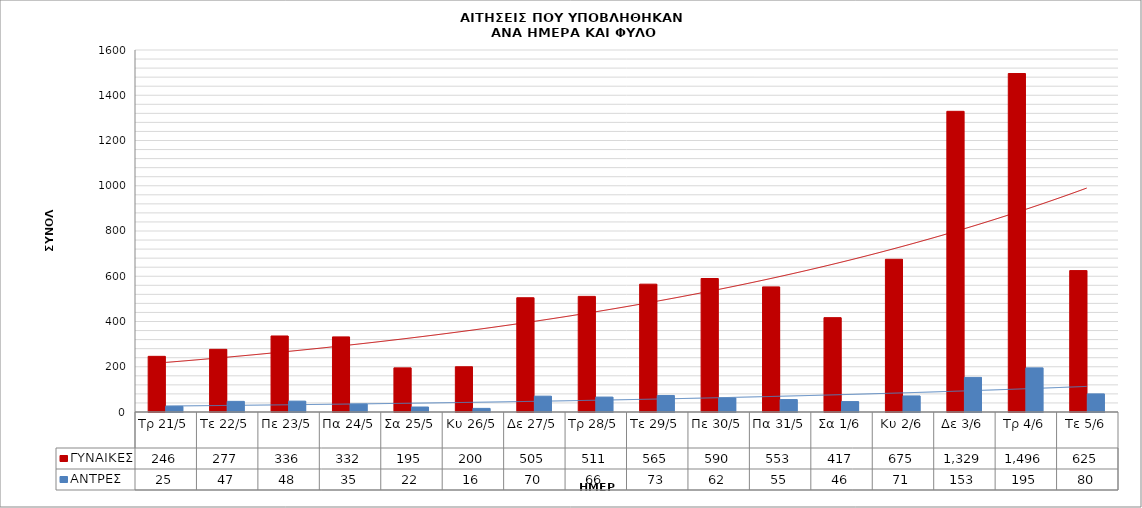
| Category | ΓΥΝΑΙΚΕΣ | ΑΝΤΡΕΣ |
|---|---|---|
| Τρ 21/5 | 246 | 25 |
| Τε 22/5 | 277 | 47 |
| Πε 23/5 | 336 | 48 |
| Πα 24/5 | 332 | 35 |
| Σα 25/5 | 195 | 22 |
| Κυ 26/5 | 200 | 16 |
| Δε 27/5 | 505 | 70 |
| Τρ 28/5 | 511 | 66 |
| Τε 29/5 | 565 | 73 |
| Πε 30/5 | 590 | 62 |
| Πα 31/5 | 553 | 55 |
| Σα 1/6 | 417 | 46 |
| Κυ 2/6 | 675 | 71 |
| Δε 3/6 | 1329 | 153 |
| Τρ 4/6 | 1496 | 195 |
| Τε 5/6 | 625 | 80 |